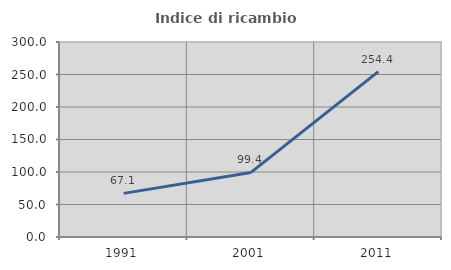
| Category | Indice di ricambio occupazionale  |
|---|---|
| 1991.0 | 67.1 |
| 2001.0 | 99.371 |
| 2011.0 | 254.426 |